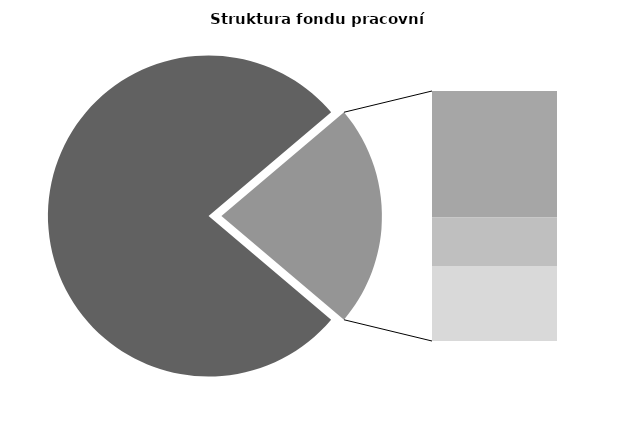
| Category | Series 0 |
|---|---|
| Průměrná měsíční odpracovaná doba bez přesčasu | 134.108 |
| Dovolená | 19.555 |
| Nemoc | 7.478 |
| Jiné | 11.594 |